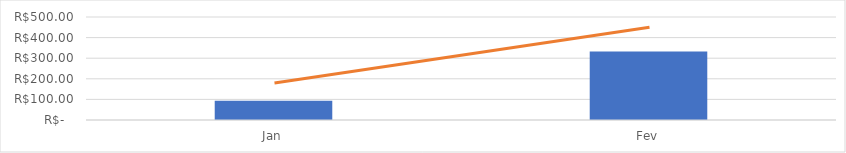
| Category | Real |
|---|---|
| 0 | 94 |
| 1 | 332.6 |